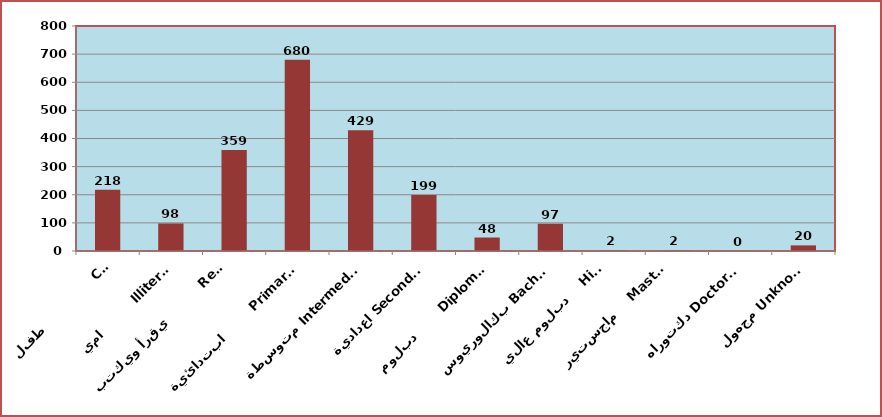
| Category | Series 0 |
|---|---|
| طفل              Child | 218 |
| امي         Illiterate | 98 |
| يقرأ ويكتب          Read 
& write | 359 |
| ابتدائية        Primary      | 680 |
| متوسطة Intermediate | 429 |
| اعدادية Secondary | 199 |
| دبلوم       Diploma     | 48 |
| بكالوريوس Bachelor | 97 |
| دبلوم عالي    High
 diploma | 2 |
| ماجستير    Master 
sdegree | 2 |
| دكتوراه Doctorate | 0 |
| مجهول Unknown | 20 |